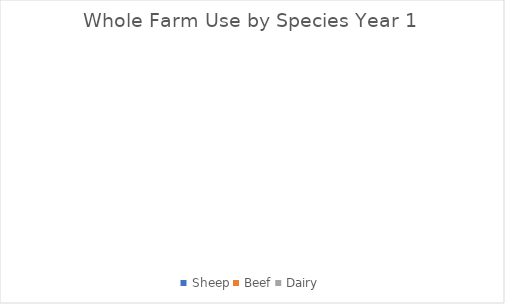
| Category | Series 0 |
|---|---|
| Sheep | 0 |
| Beef | 0 |
| Dairy | 0 |